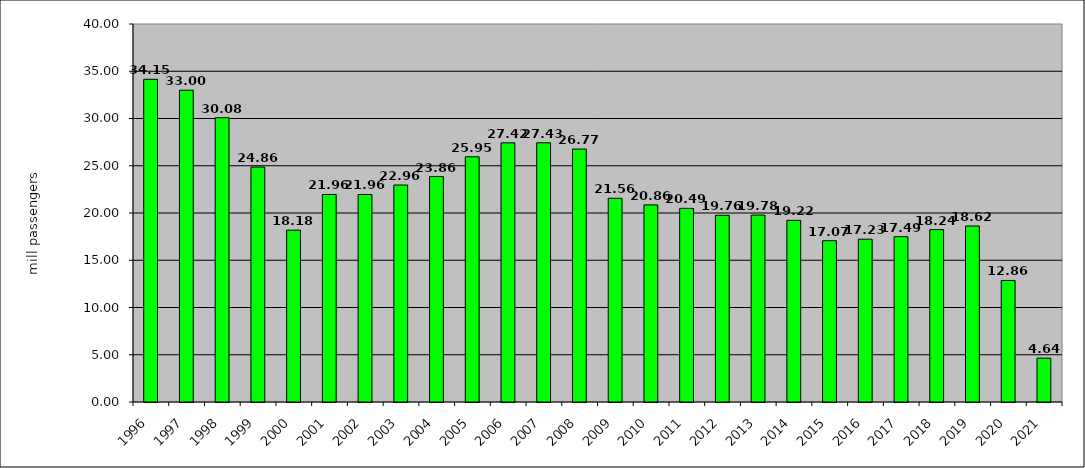
| Category | Series 0 |
|---|---|
| 1996.0 | 34.147 |
| 1997.0 | 32.995 |
| 1998.0 | 30.084 |
| 1999.0 | 24.861 |
| 2000.0 | 18.184 |
| 2001.0 | 21.959 |
| 2002.0 | 21.959 |
| 2003.0 | 22.96 |
| 2004.0 | 23.855 |
| 2005.0 | 25.948 |
| 2006.0 | 27.421 |
| 2007.0 | 27.43 |
| 2008.0 | 26.767 |
| 2009.0 | 21.556 |
| 2010.0 | 20.857 |
| 2011.0 | 20.492 |
| 2012.0 | 19.757 |
| 2013.0 | 19.78 |
| 2014.0 | 19.222 |
| 2015.0 | 17.07 |
| 2016.0 | 17.228 |
| 2017.0 | 17.493 |
| 2018.0 | 18.241 |
| 2019.0 | 18.624 |
| 2020.0 | 12.862 |
| 2021.0 | 4.641 |